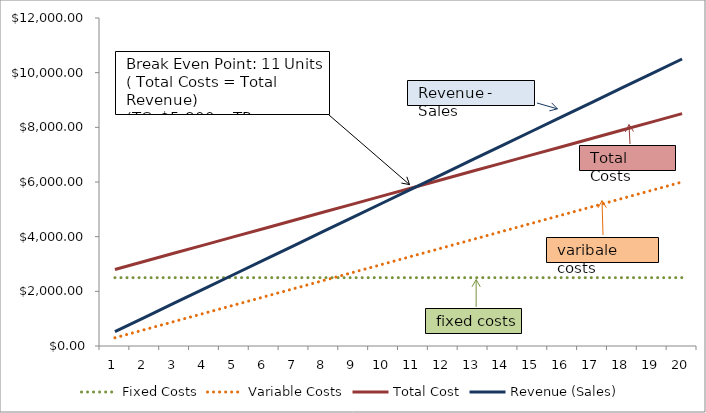
| Category | Fixed Costs | Variable Costs | Total Cost | Revenue (Sales) |
|---|---|---|---|---|
| 0 | 2500 | 300 | 2800 | 525 |
| 1 | 2500 | 600 | 3100 | 1050 |
| 2 | 2500 | 900 | 3400 | 1575 |
| 3 | 2500 | 1200 | 3700 | 2100 |
| 4 | 2500 | 1500 | 4000 | 2625 |
| 5 | 2500 | 1800 | 4300 | 3150 |
| 6 | 2500 | 2100 | 4600 | 3675 |
| 7 | 2500 | 2400 | 4900 | 4200 |
| 8 | 2500 | 2700 | 5200 | 4725 |
| 9 | 2500 | 3000 | 5500 | 5250 |
| 10 | 2500 | 3300 | 5800 | 5775 |
| 11 | 2500 | 3600 | 6100 | 6300 |
| 12 | 2500 | 3900 | 6400 | 6825 |
| 13 | 2500 | 4200 | 6700 | 7350 |
| 14 | 2500 | 4500 | 7000 | 7875 |
| 15 | 2500 | 4800 | 7300 | 8400 |
| 16 | 2500 | 5100 | 7600 | 8925 |
| 17 | 2500 | 5400 | 7900 | 9450 |
| 18 | 2500 | 5700 | 8200 | 9975 |
| 19 | 2500 | 6000 | 8500 | 10500 |